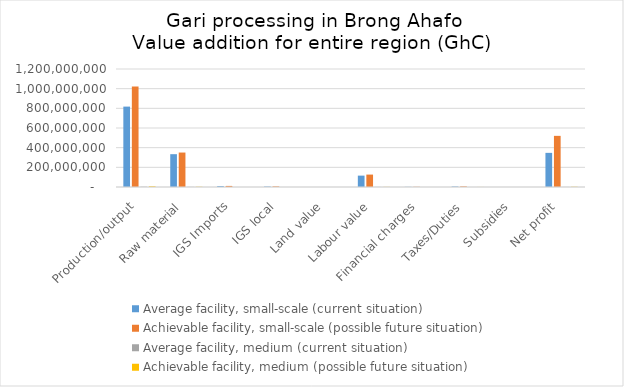
| Category | Average facility, small-scale (current situation) | Achievable facility, small-scale (possible future situation) | Average facility, medium (current situation) | Achievable facility, medium (possible future situation) |
|---|---|---|---|---|
| Production/output | 817600000 | 1022000000 | 2940000 | 7000000 |
| Raw material | 333756000 | 350400000 | 1200000 | 2400000 |
| IGS Imports | 9380500 | 11023000 | 115425 | 226575 |
| IGS local | 4854500 | 6132000 | 89692.5 | 162887.5 |
| Land value | 0 | 0 | 0 | 0 |
| Labour value | 115675800 | 126297300 | 565632 | 1213470 |
| Financial charges | 1606000 | 1971000 | 35220 | 72000 |
| Taxes/Duties | 5146500 | 6059000 | 259560 | 521975 |
| Subsidies | 0 | 0 | 0 | 0 |
| Net profit | 347180700 | 520117700 | 674470.5 | 2403092.5 |